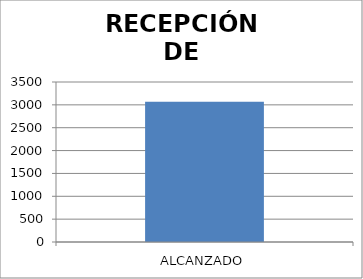
| Category | FOLIO |
|---|---|
| ALCANZADO | 3069 |